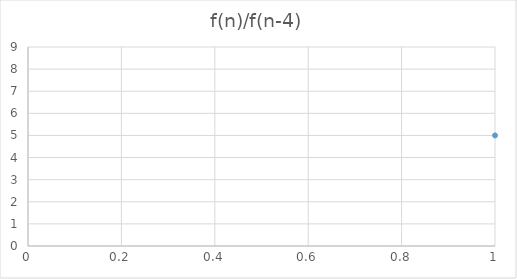
| Category | Series 0 |
|---|---|
| 0 | 5 |
| 1 | 8 |
| 2 | 6.5 |
| 3 | 7 |
| 4 | 6.8 |
| 5 | 6.875 |
| 6 | 6.846 |
| 7 | 6.857 |
| 8 | 6.853 |
| 9 | 6.855 |
| 10 | 6.854 |
| 11 | 6.854 |
| 12 | 6.854 |
| 13 | 6.854 |
| 14 | 6.854 |
| 15 | 6.854 |
| 16 | 6.854 |
| 17 | 6.854 |
| 18 | 6.854 |
| 19 | 6.854 |
| 20 | 6.854 |
| 21 | 6.854 |
| 22 | 6.854 |
| 23 | 6.854 |
| 24 | 6.854 |
| 25 | 6.854 |
| 26 | 6.854 |
| 27 | 6.854 |
| 28 | 6.854 |
| 29 | 6.854 |
| 30 | 6.854 |
| 31 | 6.854 |
| 32 | 6.854 |
| 33 | 6.854 |
| 34 | 6.854 |
| 35 | 6.854 |
| 36 | 6.854 |
| 37 | 6.854 |
| 38 | 6.854 |
| 39 | 6.854 |
| 40 | 6.854 |
| 41 | 6.854 |
| 42 | 6.854 |
| 43 | 6.854 |
| 44 | 6.854 |
| 45 | 6.854 |
| 46 | 6.854 |
| 47 | 6.854 |
| 48 | 6.854 |
| 49 | 6.854 |
| 50 | 6.854 |
| 51 | 6.854 |
| 52 | 6.854 |
| 53 | 6.854 |
| 54 | 6.854 |
| 55 | 6.854 |
| 56 | 6.854 |
| 57 | 6.854 |
| 58 | 6.854 |
| 59 | 6.854 |
| 60 | 6.854 |
| 61 | 6.854 |
| 62 | 6.854 |
| 63 | 6.854 |
| 64 | 6.854 |
| 65 | 6.854 |
| 66 | 6.854 |
| 67 | 6.854 |
| 68 | 6.854 |
| 69 | 6.854 |
| 70 | 6.854 |
| 71 | 6.854 |
| 72 | 6.854 |
| 73 | 6.854 |
| 74 | 6.854 |
| 75 | 6.854 |
| 76 | 6.854 |
| 77 | 6.854 |
| 78 | 6.854 |
| 79 | 6.854 |
| 80 | 6.854 |
| 81 | 6.854 |
| 82 | 6.854 |
| 83 | 6.854 |
| 84 | 6.854 |
| 85 | 6.854 |
| 86 | 6.854 |
| 87 | 6.854 |
| 88 | 6.854 |
| 89 | 6.854 |
| 90 | 6.854 |
| 91 | 6.854 |
| 92 | 6.854 |
| 93 | 6.854 |
| 94 | 6.854 |
| 95 | 6.854 |